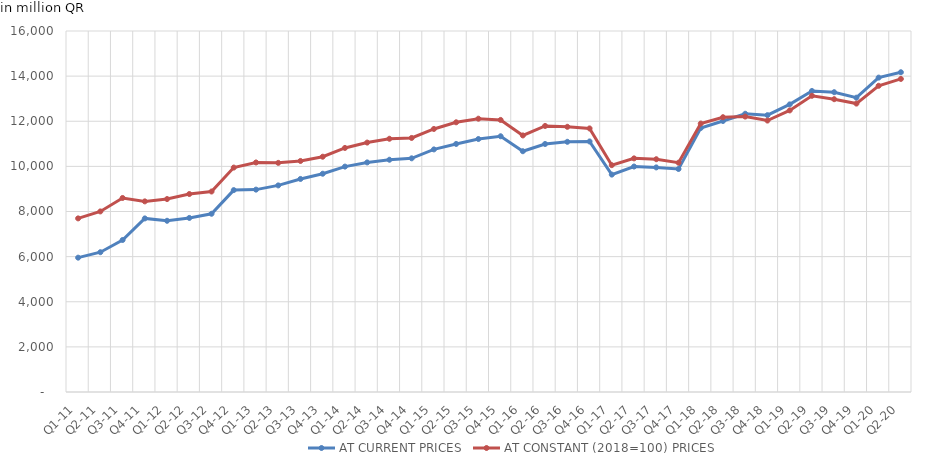
| Category | AT CURRENT PRICES | AT CONSTANT (2018=100) PRICES |
|---|---|---|
| Q1-11 | 5953.836 | 7694.843 |
| Q2-11 | 6195.49 | 8003.235 |
| Q3-11 | 6737.451 | 8599.634 |
| Q4-11 | 7693.189 | 8448.613 |
| Q1-12 | 7589.011 | 8551.906 |
| Q2-12 | 7715.291 | 8774.584 |
| Q3-12 | 7899.946 | 8886.183 |
| Q4-12 | 8948.182 | 9947.065 |
| Q1-13 | 8969.612 | 10173.221 |
| Q2-13 | 9156.382 | 10155.604 |
| Q3-13 | 9442.572 | 10239.765 |
| Q4-13 | 9673.936 | 10428.235 |
| Q1-14 | 9990.166 | 10817.551 |
| Q2-14 | 10175.72 | 11055.091 |
| Q3-14 | 10294.082 | 11224.333 |
| Q4-14 | 10357.028 | 11259.895 |
| Q1-15 | 10751.932 | 11657.991 |
| Q2-15 | 10994.405 | 11953.732 |
| Q3-15 | 11212.846 | 12113.484 |
| Q4-15 | 11334.591 | 12058.209 |
| Q1-16 | 10671.356 | 11371.048 |
| Q2-16 | 10992.547 | 11791.542 |
| Q3-16 | 11089.042 | 11753.865 |
| Q4-16 | 11104.374 | 11681.903 |
| Q1-17 | 9634.832 | 10053.618 |
| Q2-17 | 9993.326 | 10354.54 |
| Q3-17 | 9954.103 | 10316.968 |
| Q4-17 | 9883.955 | 10162.803 |
| Q1-18 | 11700.195 | 11898.597 |
| Q2-18 | 12012.448 | 12178.642 |
| Q3-18 | 12332.135 | 12207.054 |
| Q4-18 | 12270.053 | 12030.539 |
| Q1-19 | 12747.614 | 12480.104 |
| Q2-19 | 13341.818 | 13128.651 |
| Q3-19 | 13287.67 | 12977.567 |
| Q4-19 | 13044.1 | 12782.691 |
| Q1-20 | 13933.967 | 13572.097 |
| Q2-20 | 14171.848 | 13875.531 |